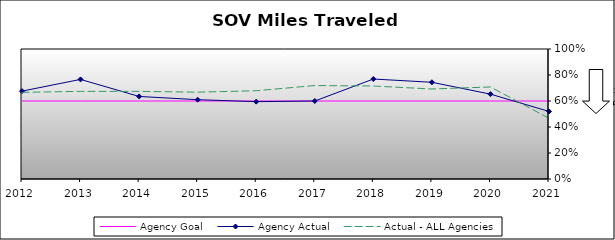
| Category | Agency Goal | Agency Actual | Actual - ALL Agencies |
|---|---|---|---|
| 2012.0 | 0.6 | 0.676 | 0.666 |
| 2013.0 | 0.6 | 0.766 | 0.674 |
| 2014.0 | 0.6 | 0.635 | 0.674 |
| 2015.0 | 0.6 | 0.61 | 0.668 |
| 2016.0 | 0.6 | 0.595 | 0.679 |
| 2017.0 | 0.6 | 0.6 | 0.719 |
| 2018.0 | 0.6 | 0.769 | 0.715 |
| 2019.0 | 0.6 | 0.744 | 0.692 |
| 2020.0 | 0.6 | 0.653 | 0.708 |
| 2021.0 | 0.6 | 0.52 | 0.467 |